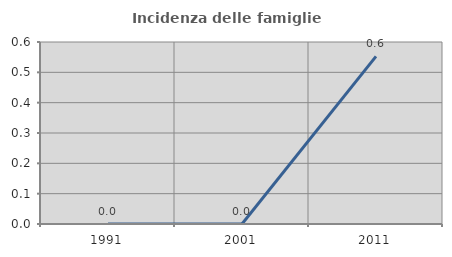
| Category | Incidenza delle famiglie numerose |
|---|---|
| 1991.0 | 0 |
| 2001.0 | 0 |
| 2011.0 | 0.552 |